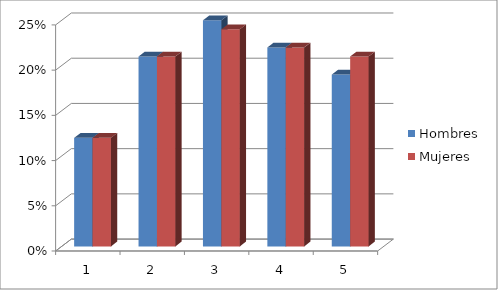
| Category | Hombres | Mujeres |
|---|---|---|
| 0 | 0.12 | 0.12 |
| 1 | 0.21 | 0.21 |
| 2 | 0.25 | 0.24 |
| 3 | 0.22 | 0.22 |
| 4 | 0.19 | 0.21 |